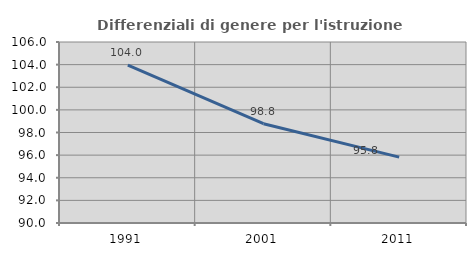
| Category | Differenziali di genere per l'istruzione superiore |
|---|---|
| 1991.0 | 103.951 |
| 2001.0 | 98.775 |
| 2011.0 | 95.822 |